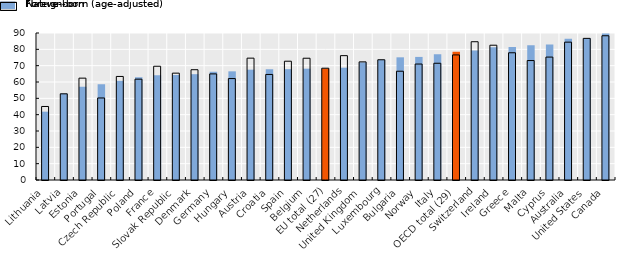
| Category | Foreign-born (age-adjusted) | Native-born |
|---|---|---|
| Lithuania | 41.83 | 45.012 |
| Latvia | 52.925 | 52.764 |
| Estonia | 57.132 | 62.355 |
| Portugal | 58.697 | 50.215 |
| Czech Republic | 60.695 | 63.397 |
| Poland | 62.953 | 61.734 |
| France | 64.124 | 69.651 |
| Slovak Republic | 64.293 | 65.416 |
| Denmark | 64.791 | 67.527 |
| Germany | 66.28 | 64.956 |
| Hungary | 66.527 | 62.097 |
| Austria | 67.548 | 74.605 |
| Croatia | 67.853 | 64.624 |
| Spain | 67.87 | 72.731 |
| Belgium | 68.151 | 74.551 |
| EU total (27) | 68.242 | 68.441 |
| Netherlands | 68.762 | 76.131 |
| United Kingdom | 72.038 | 72.326 |
| Luxembourg | 73.598 | 73.614 |
| Bulgaria | 75.111 | 66.598 |
| Norway | 75.357 | 70.996 |
| Italy | 76.989 | 71.478 |
| OECD total (29) | 78.581 | 76.579 |
| Switzerland | 79.241 | 84.653 |
| Ireland | 81.351 | 82.524 |
| Greece | 81.485 | 77.897 |
| Malta | 82.559 | 73.13 |
| Cyprus | 82.898 | 75.25 |
| Australia | 86.499 | 84.404 |
| United States | 86.718 | 86.71 |
| Canada | 89.641 | 88.31 |